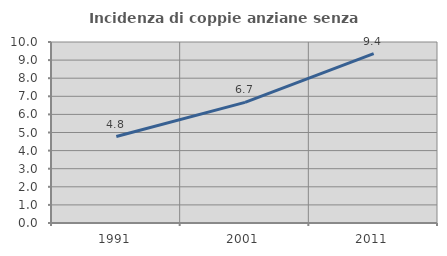
| Category | Incidenza di coppie anziane senza figli  |
|---|---|
| 1991.0 | 4.777 |
| 2001.0 | 6.667 |
| 2011.0 | 9.358 |